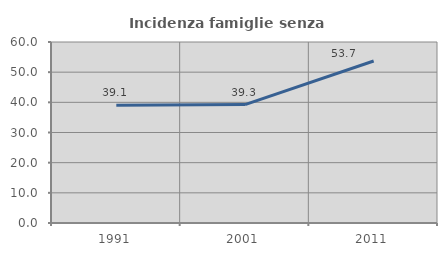
| Category | Incidenza famiglie senza nuclei |
|---|---|
| 1991.0 | 39.073 |
| 2001.0 | 39.264 |
| 2011.0 | 53.704 |